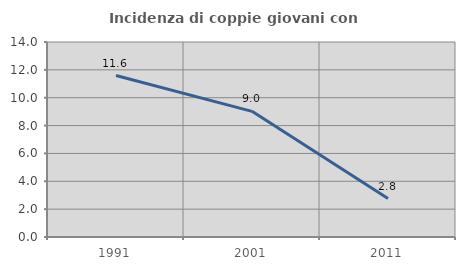
| Category | Incidenza di coppie giovani con figli |
|---|---|
| 1991.0 | 11.594 |
| 2001.0 | 9.023 |
| 2011.0 | 2.759 |